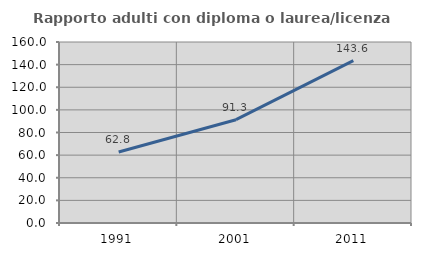
| Category | Rapporto adulti con diploma o laurea/licenza media  |
|---|---|
| 1991.0 | 62.752 |
| 2001.0 | 91.332 |
| 2011.0 | 143.596 |